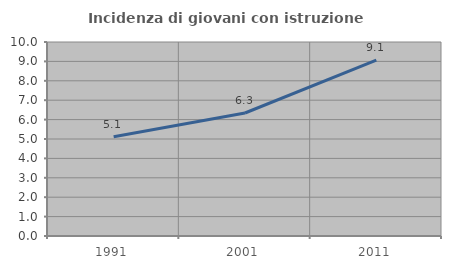
| Category | Incidenza di giovani con istruzione universitaria |
|---|---|
| 1991.0 | 5.12 |
| 2001.0 | 6.341 |
| 2011.0 | 9.062 |